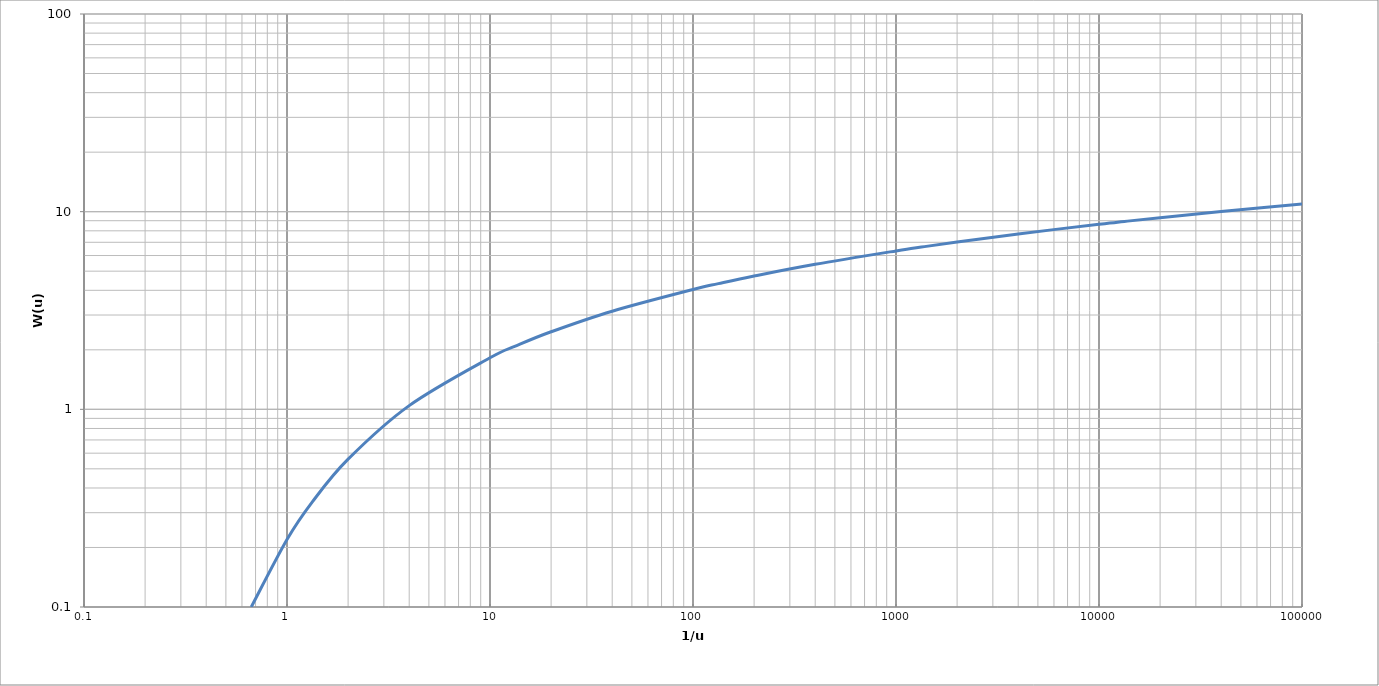
| Category | Series 0 |
|---|---|
| 99999.99999999999 | 10.936 |
| 40000.00000000001 | 10.019 |
| 20000.000000000004 | 9.326 |
| 13333.333333333332 | 8.921 |
| 10000.0 | 8.633 |
| 4000.000000000001 | 7.717 |
| 2000.0000000000005 | 7.024 |
| 1333.3333333333333 | 6.619 |
| 1000.0 | 6.332 |
| 400.00000000000006 | 5.417 |
| 200.00000000000003 | 4.726 |
| 133.33333333333334 | 4.323 |
| 100.0 | 4.038 |
| 40.00000000000001 | 3.136 |
| 20.000000000000004 | 2.468 |
| 13.333333333333334 | 2.087 |
| 10.0 | 1.823 |
| 4.000000000000001 | 1.044 |
| 2.0000000000000004 | 0.56 |
| 1.3333333333333333 | 0.34 |
| 1.0 | 0.219 |
| 0.6666666666666666 | 0.1 |